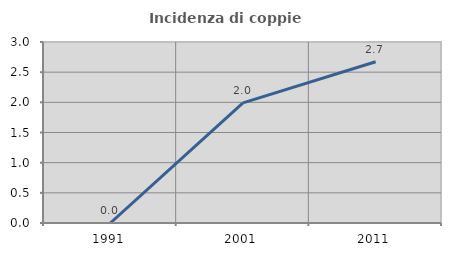
| Category | Incidenza di coppie miste |
|---|---|
| 1991.0 | 0 |
| 2001.0 | 1.992 |
| 2011.0 | 2.672 |